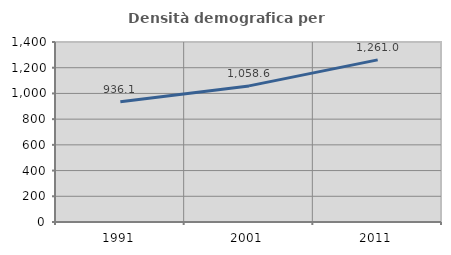
| Category | Densità demografica |
|---|---|
| 1991.0 | 936.114 |
| 2001.0 | 1058.59 |
| 2011.0 | 1261.006 |